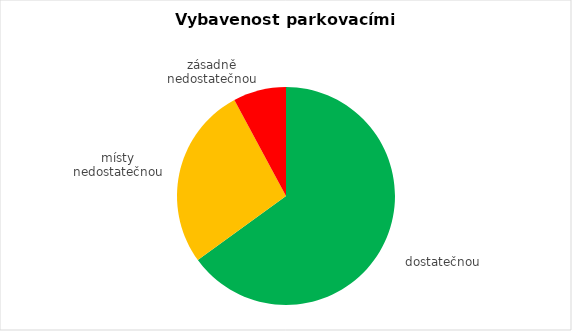
| Category | Series 0 |
|---|---|
| dostatečnou | 182 |
| místy nedostatečnou | 76 |
| zásadně nedostatečnou | 22 |